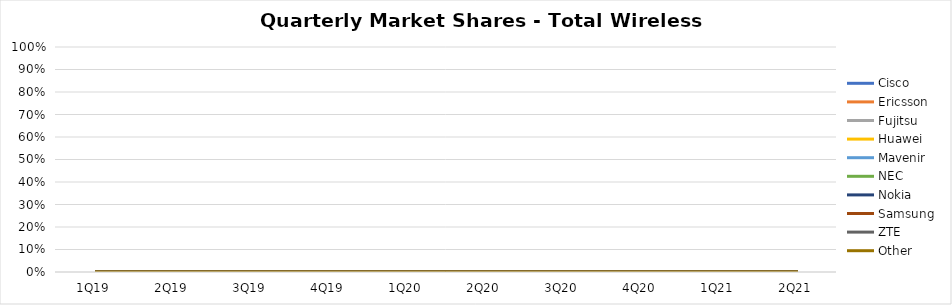
| Category | Cisco | Ericsson | Fujitsu | Huawei | Mavenir | NEC | Nokia | Samsung | ZTE | Other |
|---|---|---|---|---|---|---|---|---|---|---|
| 1Q19 | 0 | 0 | 0 | 0 | 0 | 0 | 0 | 0 | 0 | 0 |
| 2Q19 | 0 | 0 | 0 | 0 | 0 | 0 | 0 | 0 | 0 | 0 |
| 3Q19 | 0 | 0 | 0 | 0 | 0 | 0 | 0 | 0 | 0 | 0 |
| 4Q19 | 0 | 0 | 0 | 0 | 0 | 0 | 0 | 0 | 0 | 0 |
| 1Q20 | 0 | 0 | 0 | 0 | 0 | 0 | 0 | 0 | 0 | 0 |
| 2Q20 | 0 | 0 | 0 | 0 | 0 | 0 | 0 | 0 | 0 | 0 |
| 3Q20 | 0 | 0 | 0 | 0 | 0 | 0 | 0 | 0 | 0 | 0 |
| 4Q20 | 0 | 0 | 0 | 0 | 0 | 0 | 0 | 0 | 0 | 0 |
| 1Q21 | 0 | 0 | 0 | 0 | 0 | 0 | 0 | 0 | 0 | 0 |
| 2Q21 | 0 | 0 | 0 | 0 | 0 | 0 | 0 | 0 | 0 | 0 |